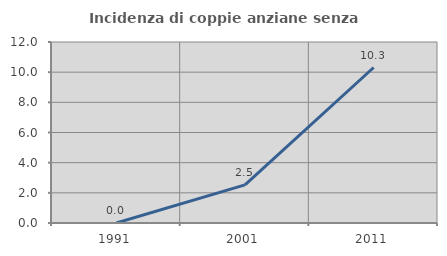
| Category | Incidenza di coppie anziane senza figli  |
|---|---|
| 1991.0 | 0 |
| 2001.0 | 2.532 |
| 2011.0 | 10.309 |